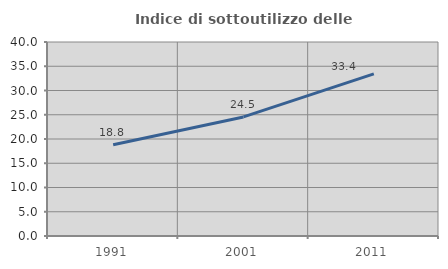
| Category | Indice di sottoutilizzo delle abitazioni  |
|---|---|
| 1991.0 | 18.802 |
| 2001.0 | 24.548 |
| 2011.0 | 33.443 |